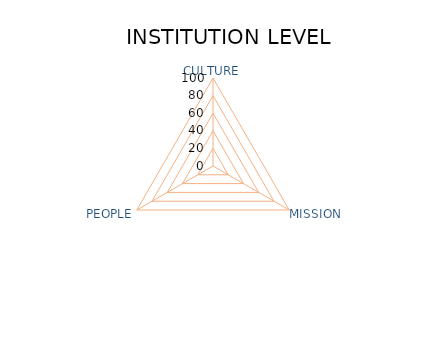
| Category | "Dimensions" |
|---|---|
| CULTURE | 0 |
| MISSION | 0 |
| PEOPLE | 0 |